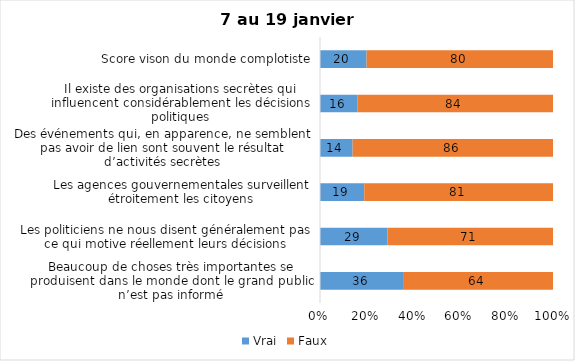
| Category | Vrai | Faux |
|---|---|---|
| Beaucoup de choses très importantes se produisent dans le monde dont le grand public n’est pas informé | 36 | 64 |
| Les politiciens ne nous disent généralement pas ce qui motive réellement leurs décisions | 29 | 71 |
| Les agences gouvernementales surveillent étroitement les citoyens | 19 | 81 |
| Des événements qui, en apparence, ne semblent pas avoir de lien sont souvent le résultat d’activités secrètes | 14 | 86 |
| Il existe des organisations secrètes qui influencent considérablement les décisions politiques | 16 | 84 |
| Score vison du monde complotiste | 20 | 80 |